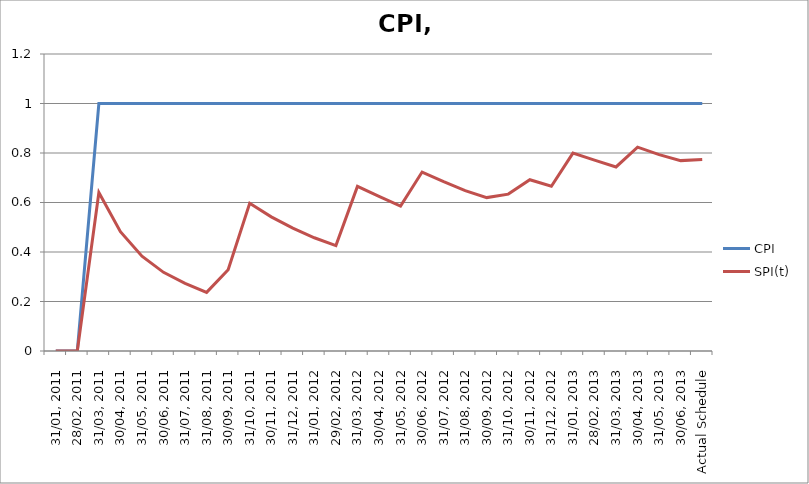
| Category | CPI | SPI(t) |
|---|---|---|
| 31/01, 2011 | 0 | 0 |
| 28/02, 2011 | 0 | 0 |
| 31/03, 2011 | 1 | 0.641 |
| 30/04, 2011 | 1 | 0.482 |
| 31/05, 2011 | 1 | 0.383 |
| 30/06, 2011 | 1 | 0.318 |
| 31/07, 2011 | 1 | 0.273 |
| 31/08, 2011 | 1 | 0.237 |
| 30/09, 2011 | 1 | 0.328 |
| 31/10, 2011 | 1 | 0.597 |
| 30/11, 2011 | 1 | 0.542 |
| 31/12, 2011 | 1 | 0.496 |
| 31/01, 2012 | 1 | 0.457 |
| 29/02, 2012 | 1 | 0.426 |
| 31/03, 2012 | 1 | 0.665 |
| 30/04, 2012 | 1 | 0.625 |
| 31/05, 2012 | 1 | 0.586 |
| 30/06, 2012 | 1 | 0.723 |
| 31/07, 2012 | 1 | 0.684 |
| 31/08, 2012 | 1 | 0.648 |
| 30/09, 2012 | 1 | 0.62 |
| 31/10, 2012 | 1 | 0.634 |
| 30/11, 2012 | 1 | 0.692 |
| 31/12, 2012 | 1 | 0.666 |
| 31/01, 2013 | 1 | 0.8 |
| 28/02, 2013 | 1 | 0.771 |
| 31/03, 2013 | 1 | 0.744 |
| 30/04, 2013 | 1 | 0.824 |
| 31/05, 2013 | 1 | 0.794 |
| 30/06, 2013 | 1 | 0.769 |
| Actual Schedule | 1 | 0.774 |